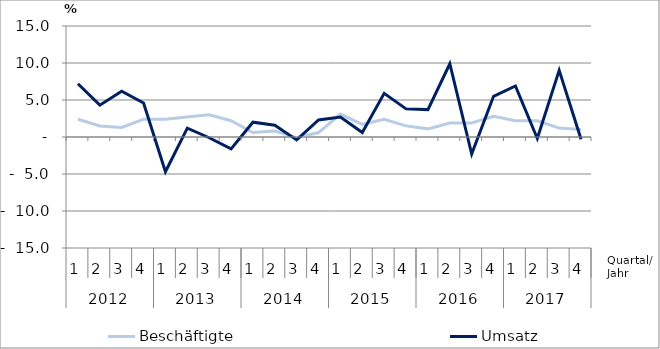
| Category | Beschäftigte | Umsatz |
|---|---|---|
| 0 | 2.4 | 7.2 |
| 1 | 1.5 | 4.3 |
| 2 | 1.3 | 6.2 |
| 3 | 2.4 | 4.6 |
| 4 | 2.4 | -4.7 |
| 5 | 2.7 | 1.2 |
| 6 | 3 | -0.1 |
| 7 | 2.2 | -1.6 |
| 8 | 0.6 | 2 |
| 9 | 0.8 | 1.6 |
| 10 | -0.1 | -0.4 |
| 11 | 0.6 | 2.3 |
| 12 | 3.1 | 2.7 |
| 13 | 1.7 | 0.6 |
| 14 | 2.4 | 5.9 |
| 15 | 1.5 | 3.8 |
| 16 | 1.1 | 3.7 |
| 17 | 1.9 | 9.9 |
| 18 | 1.9 | -2.3 |
| 19 | 2.8 | 5.5 |
| 20 | 2.2 | 6.9 |
| 21 | 2.2 | -0.2 |
| 22 | 1.2 | 9 |
| 23 | 1 | -0.3 |